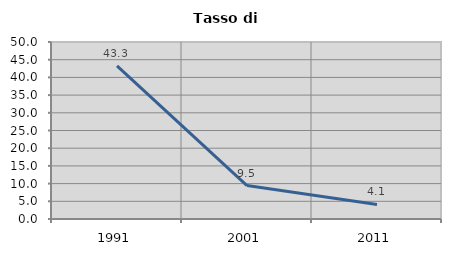
| Category | Tasso di disoccupazione   |
|---|---|
| 1991.0 | 43.266 |
| 2001.0 | 9.453 |
| 2011.0 | 4.118 |